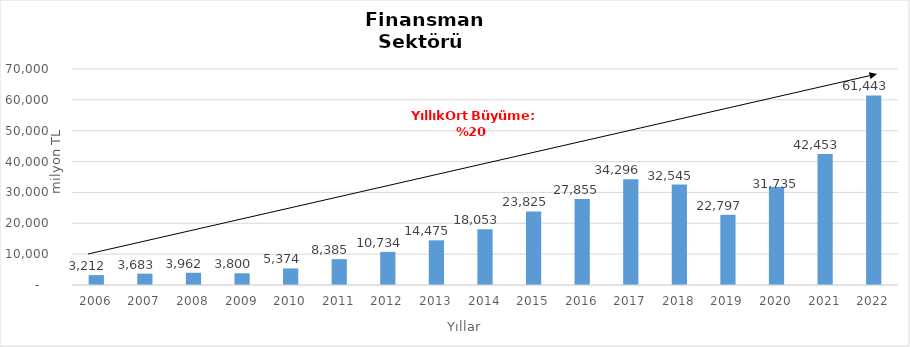
| Category | Finansman |
|---|---|
| 2006.0 | 3212.153 |
| 2007.0 | 3682.969 |
| 2008.0 | 3962.227 |
| 2009.0 | 3800.05 |
| 2010.0 | 5373.931 |
| 2011.0 | 8385.227 |
| 2012.0 | 10734.23 |
| 2013.0 | 14474.899 |
| 2014.0 | 18053.437 |
| 2015.0 | 23825 |
| 2016.0 | 27855 |
| 2017.0 | 34296 |
| 2018.0 | 32545 |
| 2019.0 | 22797 |
| 2020.0 | 31735 |
| 2021.0 | 42453 |
| 2022.0 | 61443 |